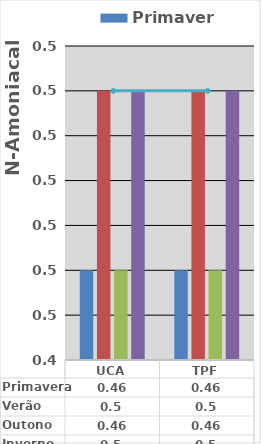
| Category | Primavera | Verão | Outono | Inverno |
|---|---|---|---|---|
| UCA | 0.46 | 0.5 | 0.46 | 0.5 |
| TPF | 0.46 | 0.5 | 0.46 | 0.5 |